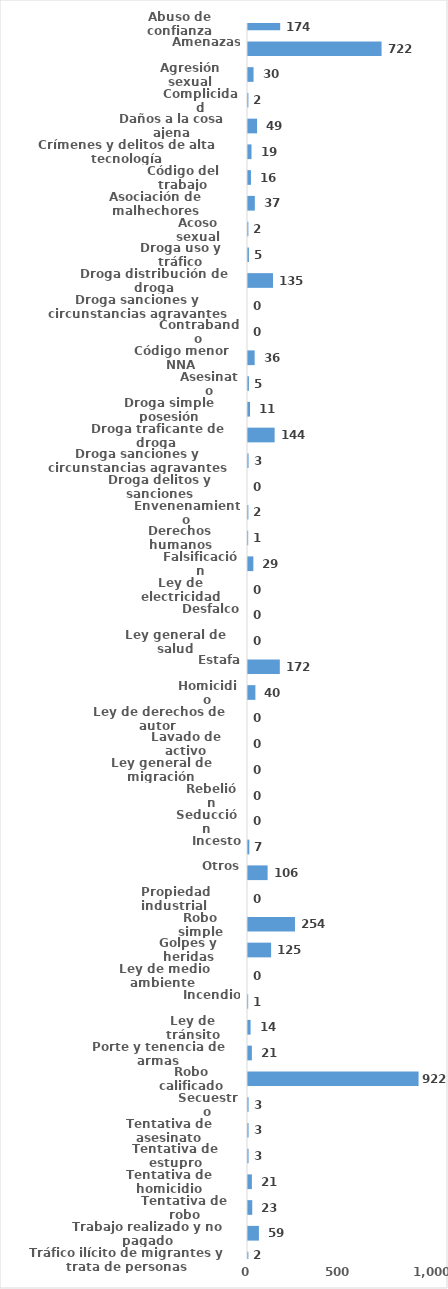
| Category | Series 0 |
|---|---|
| Abuso de confianza | 174 |
| Amenazas | 722 |
| Agresión sexual | 30 |
| Complicidad | 2 |
| Daños a la cosa ajena | 49 |
| Crímenes y delitos de alta tecnología | 19 |
| Código del trabajo | 16 |
| Asociación de malhechores | 37 |
| Acoso sexual | 2 |
| Droga uso y tráfico | 5 |
| Droga distribución de droga | 135 |
| Droga sanciones y circunstancias agravantes | 0 |
| Contrabando | 0 |
| Código menor NNA | 36 |
| Asesinato | 5 |
| Droga simple posesión | 11 |
| Droga traficante de droga  | 144 |
| Droga sanciones y circunstancias agravantes | 3 |
| Droga delitos y sanciones | 0 |
| Envenenamiento | 2 |
| Derechos humanos | 1 |
| Falsificación | 29 |
| Ley de electricidad | 0 |
| Desfalco | 0 |
| Ley general de salud | 0 |
| Estafa | 172 |
| Homicidio | 40 |
| Ley de derechos de autor  | 0 |
| Lavado de activo | 0 |
| Ley general de migración | 0 |
| Rebelión | 0 |
| Seducción | 0 |
| Incesto | 7 |
| Otros | 106 |
| Propiedad industrial  | 0 |
| Robo simple | 254 |
| Golpes y heridas | 125 |
| Ley de medio ambiente  | 0 |
| Incendio | 1 |
| Ley de tránsito | 14 |
| Porte y tenencia de armas | 21 |
| Robo calificado | 922 |
| Secuestro | 3 |
| Tentativa de asesinato | 3 |
| Tentativa de estupro | 3 |
| Tentativa de homicidio | 21 |
| Tentativa de robo | 23 |
| Trabajo realizado y no pagado | 59 |
| Tráfico ilícito de migrantes y trata de personas | 2 |